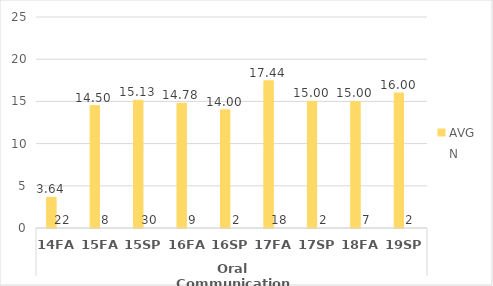
| Category | HS.AAS - AVG | HS.AAS - N |
|---|---|---|
| 0 | 3.636 | 22 |
| 1 | 14.5 | 8 |
| 2 | 15.133 | 30 |
| 3 | 14.778 | 9 |
| 4 | 14 | 2 |
| 5 | 17.444 | 18 |
| 6 | 15 | 2 |
| 7 | 15 | 7 |
| 8 | 16 | 2 |